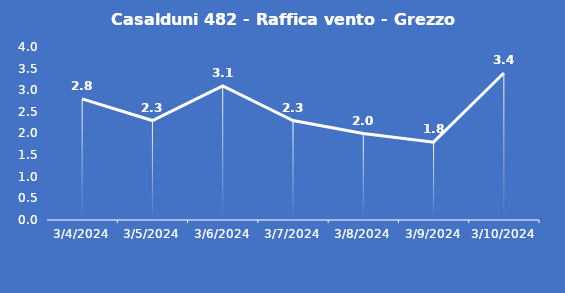
| Category | Casalduni 482 - Raffica vento - Grezzo (m/s) |
|---|---|
| 3/4/24 | 2.8 |
| 3/5/24 | 2.3 |
| 3/6/24 | 3.1 |
| 3/7/24 | 2.3 |
| 3/8/24 | 2 |
| 3/9/24 | 1.8 |
| 3/10/24 | 3.4 |